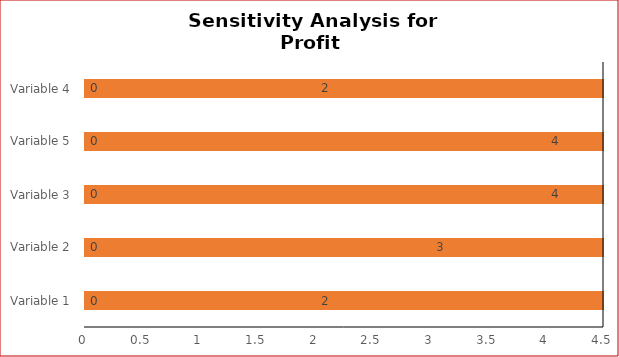
| Category | Low | High |
|---|---|---|
| Variable 1 | 2 | 12 |
| Variable 2 | 3 | 13 |
| Variable 3 | 4 | 14 |
| Variable 5 | 4 | 16 |
| Variable 4 | 2 | 15 |